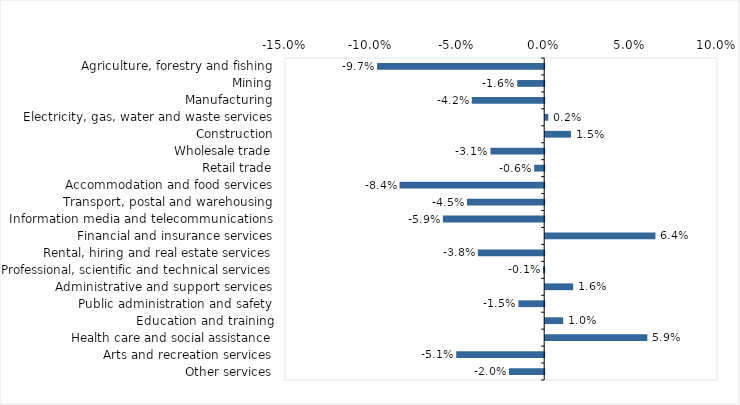
| Category | This week |
|---|---|
| Agriculture, forestry and fishing | -0.097 |
| Mining | -0.016 |
| Manufacturing | -0.042 |
| Electricity, gas, water and waste services | 0.002 |
| Construction | 0.015 |
| Wholesale trade | -0.031 |
| Retail trade | -0.006 |
| Accommodation and food services | -0.084 |
| Transport, postal and warehousing | -0.045 |
| Information media and telecommunications | -0.059 |
| Financial and insurance services | 0.064 |
| Rental, hiring and real estate services | -0.038 |
| Professional, scientific and technical services | -0.001 |
| Administrative and support services | 0.016 |
| Public administration and safety | -0.015 |
| Education and training | 0.01 |
| Health care and social assistance | 0.059 |
| Arts and recreation services | -0.051 |
| Other services | -0.02 |